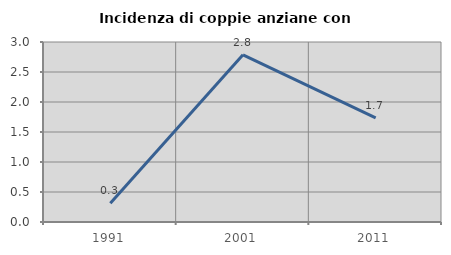
| Category | Incidenza di coppie anziane con figli |
|---|---|
| 1991.0 | 0.314 |
| 2001.0 | 2.786 |
| 2011.0 | 1.734 |